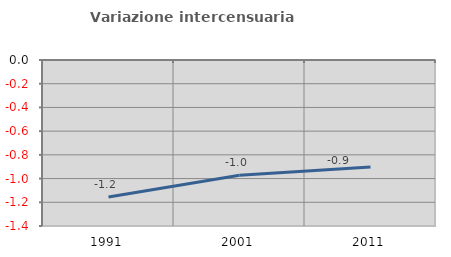
| Category | Variazione intercensuaria annua |
|---|---|
| 1991.0 | -1.156 |
| 2001.0 | -0.973 |
| 2011.0 | -0.903 |